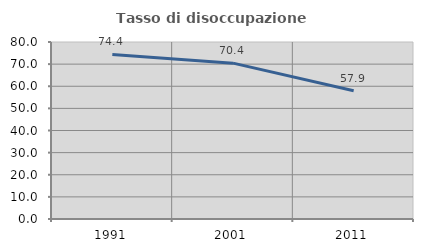
| Category | Tasso di disoccupazione giovanile  |
|---|---|
| 1991.0 | 74.365 |
| 2001.0 | 70.448 |
| 2011.0 | 57.938 |